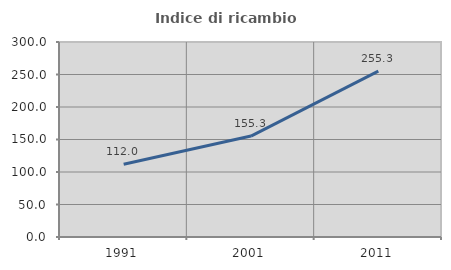
| Category | Indice di ricambio occupazionale  |
|---|---|
| 1991.0 | 111.97 |
| 2001.0 | 155.308 |
| 2011.0 | 255.314 |